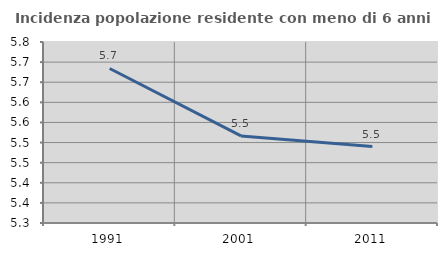
| Category | Incidenza popolazione residente con meno di 6 anni |
|---|---|
| 1991.0 | 5.684 |
| 2001.0 | 5.516 |
| 2011.0 | 5.49 |